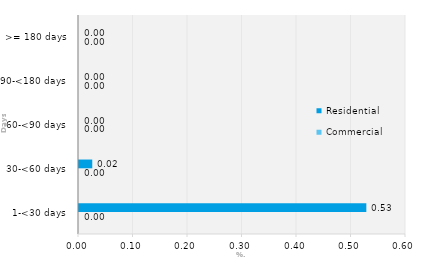
| Category | Commercial | Residential |
|---|---|---|
| 1-<30 days | 0 | 0.527 |
| 30-<60 days | 0 | 0.024 |
| 60-<90 days | 0 | 0 |
| 90-<180 days | 0 | 0 |
| >= 180 days | 0 | 0 |